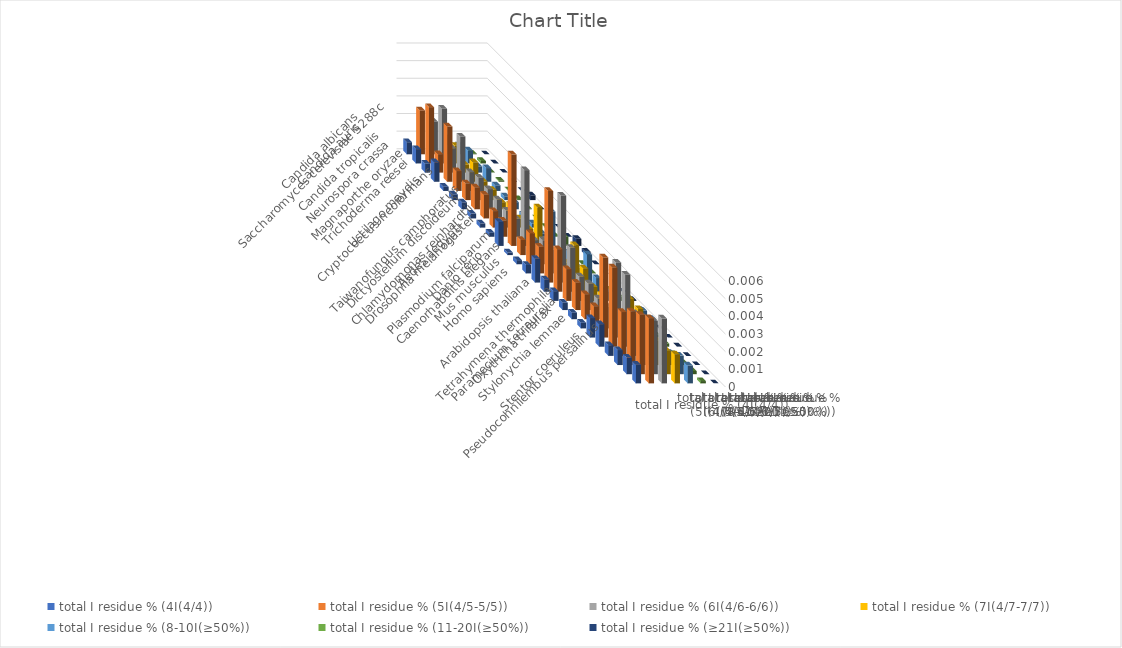
| Category | total I residue % (4I(4/4)) | total I residue % (5I(4/5-5/5)) | total I residue % (6I(4/6-6/6)) | total I residue % (7I(4/7-7/7)) | total I residue % (8-10I(≥50%)) | total I residue % (11-20I(≥50%)) | total I residue % (≥21I(≥50%)) |
|---|---|---|---|---|---|---|---|
| Saccharomyces cerevisiae S288c | 0.001 | 0.002 | 0.002 | 0.001 | 0.001 | 0 | 0 |
| Candida albicans | 0.001 | 0.003 | 0.003 | 0.001 | 0.001 | 0 | 0 |
| Candida auris | 0.001 | 0.001 | 0.001 | 0 | 0 | 0 | 0 |
| Candida tropicalis | 0.001 | 0.003 | 0.003 | 0.001 | 0.001 | 0 | 0 |
| Neurospora crassa | 0 | 0.001 | 0.001 | 0.001 | 0 | 0 | 0 |
| Magnaporthe oryzae | 0 | 0.001 | 0.001 | 0.001 | 0 | 0 | 0 |
| Trichoderma reesei | 0 | 0.001 | 0.001 | 0 | 0 | 0 | 0 |
| Cryptococcus neoformans | 0 | 0.001 | 0.001 | 0.001 | 0 | 0 | 0 |
| Ustilago maydis | 0 | 0.001 | 0.001 | 0.001 | 0 | 0 | 0 |
| Taiwanofungus camphoratus | 0 | 0.001 | 0.001 | 0 | 0 | 0 | 0 |
| Dictyostelium discoideum | 0.001 | 0.005 | 0.004 | 0.002 | 0.002 | 0.001 | 0 |
| Chlamydomonas reinhardtii | 0 | 0.001 | 0.001 | 0 | 0 | 0 | 0 |
| Drosophila melanogaster | 0 | 0.002 | 0.001 | 0.001 | 0.001 | 0 | 0 |
| Aedes aegypti | 0 | 0.002 | 0.001 | 0.001 | 0 | 0 | 0 |
| Plasmodium falciparum | 0.001 | 0.005 | 0.005 | 0.002 | 0.002 | 0 | 0 |
| Caenorhabditis elegans | 0.001 | 0.002 | 0.002 | 0.001 | 0.001 | 0 | 0 |
| Danio rerio | 0.001 | 0.002 | 0.001 | 0.001 | 0.001 | 0 | 0 |
| Mus musculus | 0 | 0.002 | 0.002 | 0.001 | 0 | 0 | 0 |
| Homo sapiens | 0 | 0.001 | 0.001 | 0.001 | 0 | 0 | 0 |
| Arabidopsis thaliana | 0 | 0.001 | 0.001 | 0.001 | 0 | 0 | 0 |
| Tetrahymena thermophila | 0.001 | 0.005 | 0.004 | 0.002 | 0.002 | 0 | 0 |
| Paramecium tetraurelia | 0.001 | 0.004 | 0.004 | 0.002 | 0.002 | 0 | 0 |
| Oxytricha trifallax | 0.001 | 0.002 | 0.002 | 0.001 | 0.001 | 0 | 0 |
| Stylonychia lemnae | 0.001 | 0.003 | 0.003 | 0.001 | 0.001 | 0 | 0 |
| Pseudocohnilembus persalinus | 0.001 | 0.003 | 0.003 | 0.001 | 0.001 | 0 | 0 |
| Stentor coeruleus | 0.001 | 0.004 | 0.004 | 0.002 | 0.001 | 0 | 0 |